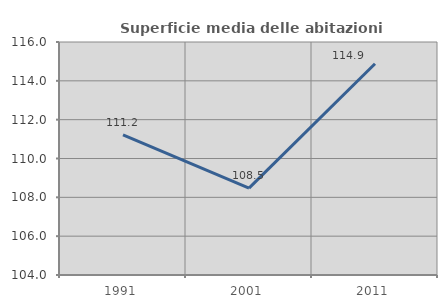
| Category | Superficie media delle abitazioni occupate |
|---|---|
| 1991.0 | 111.212 |
| 2001.0 | 108.472 |
| 2011.0 | 114.877 |